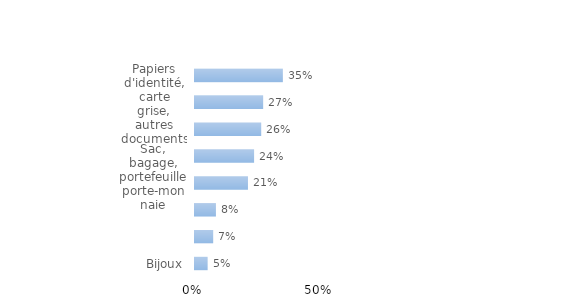
| Category | Series 0 |
|---|---|
| Bijoux | 0.051 |
| Vêtements | 0.073 |
| Clés | 0.084 |
| Sac, bagage, portefeuille porte-monnaie | 0.212 |
| Chèques, une ou des cartes bancaires | 0.236 |
| Téléphone portable | 0.265 |
| Papiers d'identité, carte grise, autres documents adm. | 0.273 |
| Argent liquide | 0.351 |